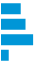
| Category | Series 0 |
|---|---|
| 0 | 0.234 |
| 1 | 0.294 |
| 2 | 0.389 |
| 3 | 0.084 |